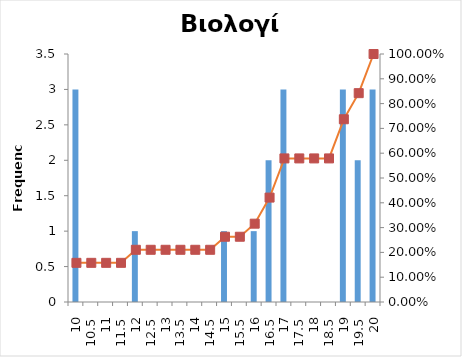
| Category | Series 0 |
|---|---|
| 10 | 3 |
| 10,5 | 0 |
| 11 | 0 |
| 11,5 | 0 |
| 12 | 1 |
| 12,5 | 0 |
| 13 | 0 |
| 13,5 | 0 |
| 14 | 0 |
| 14,5 | 0 |
| 15 | 1 |
| 15,5 | 0 |
| 16 | 1 |
| 16,5 | 2 |
| 17 | 3 |
| 17,5 | 0 |
| 18 | 0 |
| 18,5 | 0 |
| 19 | 3 |
| 19,5 | 2 |
| 20 | 3 |